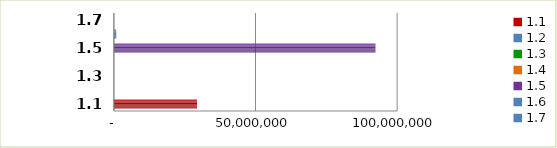
| Category | Series 0 |
|---|---|
| 1.1 | 29339252 |
| 1.2 | 0 |
| 1.3 | 0 |
| 1.4 | 0 |
| 1.5 | 92345345 |
| 1.6 | 830000 |
| 1.7 | 0 |